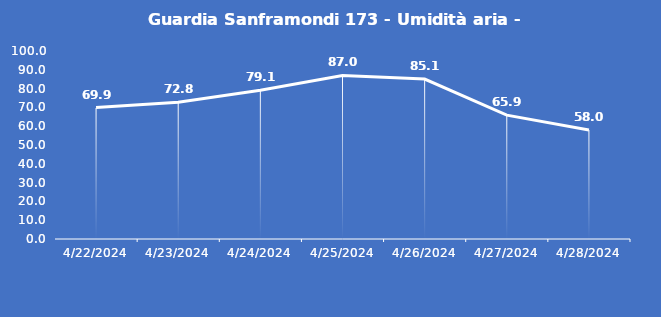
| Category | Guardia Sanframondi 173 - Umidità aria - Grezzo (%) |
|---|---|
| 4/22/24 | 69.9 |
| 4/23/24 | 72.8 |
| 4/24/24 | 79.1 |
| 4/25/24 | 87 |
| 4/26/24 | 85.1 |
| 4/27/24 | 65.9 |
| 4/28/24 | 58 |